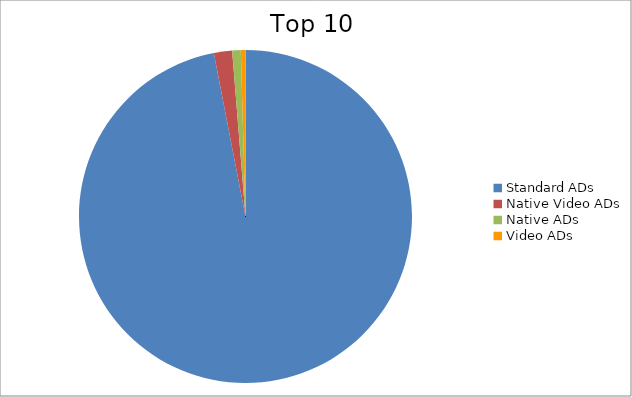
| Category | Series 0 |
|---|---|
| Standard ADs | 96.95 |
| Native Video ADs | 1.77 |
| Native ADs | 0.83 |
| Video ADs | 0.45 |